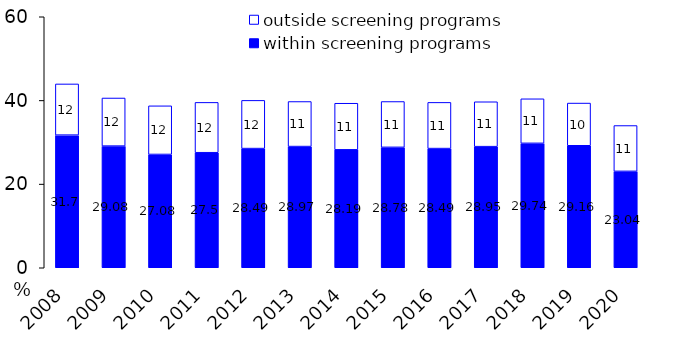
| Category | within screening programs | outside screening programs |
|---|---|---|
| 2008.0 | 31.7 | 12.24 |
| 2009.0 | 29.08 | 11.5 |
| 2010.0 | 27.08 | 11.63 |
| 2011.0 | 27.5 | 12.03 |
| 2012.0 | 28.49 | 11.52 |
| 2013.0 | 28.97 | 10.77 |
| 2014.0 | 28.19 | 11.14 |
| 2015.0 | 28.78 | 10.96 |
| 2016.0 | 28.49 | 11.04 |
| 2017.0 | 28.95 | 10.73 |
| 2018.0 | 29.74 | 10.65 |
| 2019.0 | 29.16 | 10.21 |
| 2020.0 | 23.04 | 10.96 |